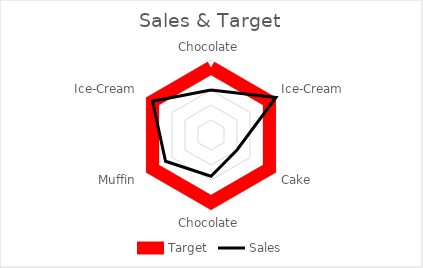
| Category | Target | Sales |
|---|---|---|
| Chocolate | 9000 | 6000 |
| Ice-Cream | 9000 | 10000 |
| Cake | 9000 | 4000 |
| Chocolate | 9000 | 5500 |
| Muffin | 9000 | 7000 |
| Ice-Cream | 9000 | 9000 |